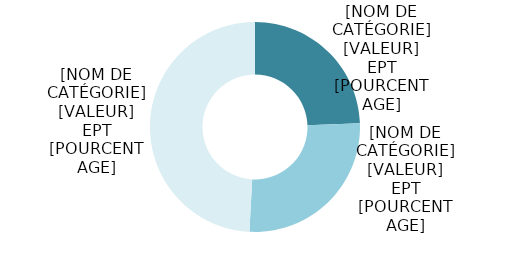
| Category | Series 0 |
|---|---|
| Genève | 1161.008 |
| Autres cantons | 1254.592 |
| De l'étranger | 2334.634 |